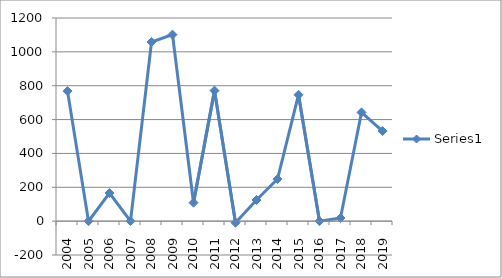
| Category | Series 0 |
|---|---|
| 2004.0 | 768 |
| 2005.0 | 0 |
| 2006.0 | 166 |
| 2007.0 | 0 |
| 2008.0 | 1058 |
| 2009.0 | 1102 |
| 2010.0 | 109 |
| 2011.0 | 770.935 |
| 2012.0 | -9.435 |
| 2013.0 | 124.894 |
| 2014.0 | 248.377 |
| 2015.0 | 746.547 |
| 2016.0 | 0 |
| 2017.0 | 18.485 |
| 2018.0 | 642.256 |
| 2019.0 | 532.06 |